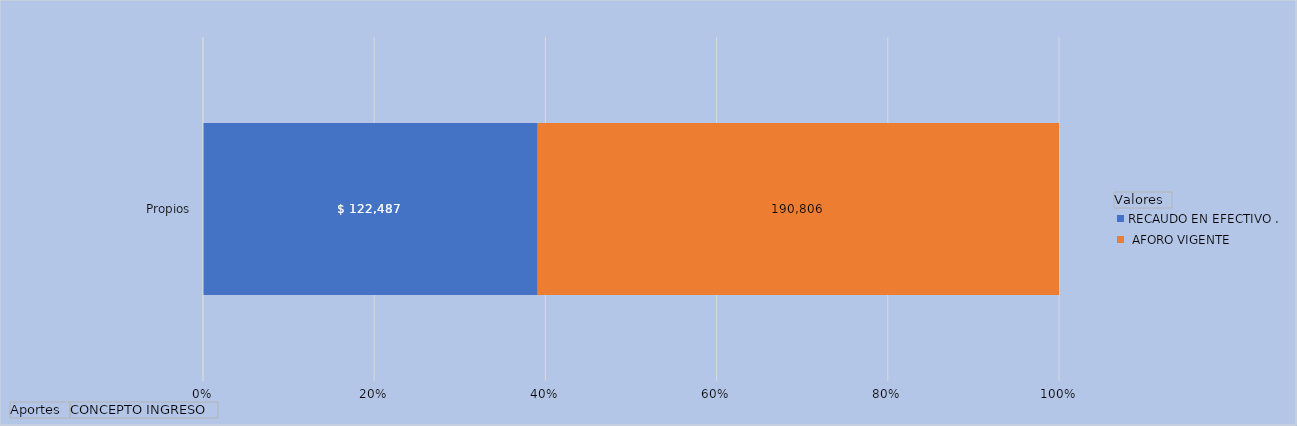
| Category | RECAUDO EN EFECTIVO . |  AFORO VIGENTE
 |
|---|---|---|
| Propios | 122486.826 | 190805.665 |